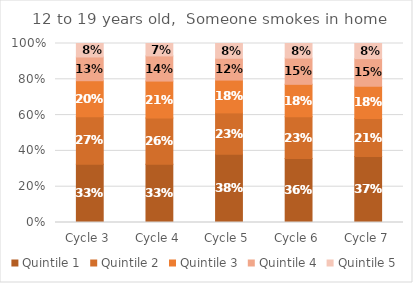
| Category | Quintile 1 | Quintile 2 | Quintile 3 | Quintile 4 | Quintile 5 |
|---|---|---|---|---|---|
| Cycle 3 | 0.326 | 0.265 | 0.201 | 0.133 | 0.075 |
| Cycle 4 | 0.325 | 0.259 | 0.206 | 0.141 | 0.069 |
| Cycle 5 | 0.381 | 0.232 | 0.183 | 0.122 | 0.082 |
| Cycle 6 | 0.358 | 0.233 | 0.182 | 0.147 | 0.081 |
| Cycle 7 | 0.369 | 0.212 | 0.181 | 0.154 | 0.085 |